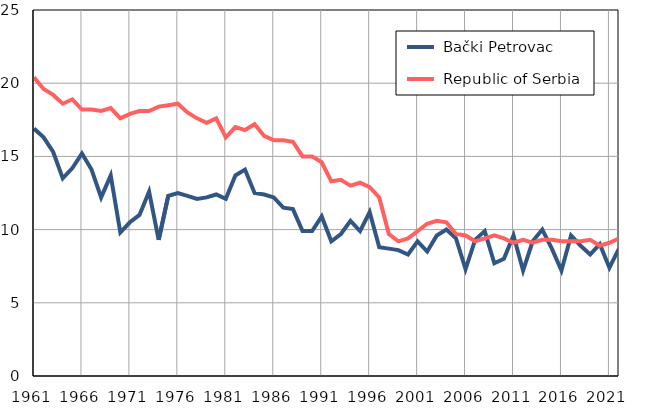
| Category |  Bački Petrovac |  Republic of Serbia |
|---|---|---|
| 1961.0 | 16.9 | 20.4 |
| 1962.0 | 16.3 | 19.6 |
| 1963.0 | 15.3 | 19.2 |
| 1964.0 | 13.5 | 18.6 |
| 1965.0 | 14.2 | 18.9 |
| 1966.0 | 15.2 | 18.2 |
| 1967.0 | 14.1 | 18.2 |
| 1968.0 | 12.2 | 18.1 |
| 1969.0 | 13.7 | 18.3 |
| 1970.0 | 9.8 | 17.6 |
| 1971.0 | 10.5 | 17.9 |
| 1972.0 | 11 | 18.1 |
| 1973.0 | 12.6 | 18.1 |
| 1974.0 | 9.3 | 18.4 |
| 1975.0 | 12.3 | 18.5 |
| 1976.0 | 12.5 | 18.6 |
| 1977.0 | 12.3 | 18 |
| 1978.0 | 12.1 | 17.6 |
| 1979.0 | 12.2 | 17.3 |
| 1980.0 | 12.4 | 17.6 |
| 1981.0 | 12.1 | 16.3 |
| 1982.0 | 13.7 | 17 |
| 1983.0 | 14.1 | 16.8 |
| 1984.0 | 12.5 | 17.2 |
| 1985.0 | 12.4 | 16.4 |
| 1986.0 | 12.2 | 16.1 |
| 1987.0 | 11.5 | 16.1 |
| 1988.0 | 11.4 | 16 |
| 1989.0 | 9.9 | 15 |
| 1990.0 | 9.9 | 15 |
| 1991.0 | 10.9 | 14.6 |
| 1992.0 | 9.2 | 13.3 |
| 1993.0 | 9.7 | 13.4 |
| 1994.0 | 10.6 | 13 |
| 1995.0 | 9.9 | 13.2 |
| 1996.0 | 11.2 | 12.9 |
| 1997.0 | 8.8 | 12.2 |
| 1998.0 | 8.7 | 9.7 |
| 1999.0 | 8.6 | 9.2 |
| 2000.0 | 8.3 | 9.4 |
| 2001.0 | 9.2 | 9.9 |
| 2002.0 | 8.5 | 10.4 |
| 2003.0 | 9.6 | 10.6 |
| 2004.0 | 10 | 10.5 |
| 2005.0 | 9.4 | 9.7 |
| 2006.0 | 7.3 | 9.6 |
| 2007.0 | 9.3 | 9.2 |
| 2008.0 | 9.9 | 9.4 |
| 2009.0 | 7.7 | 9.6 |
| 2010.0 | 8 | 9.4 |
| 2011.0 | 9.6 | 9.1 |
| 2012.0 | 7.2 | 9.3 |
| 2013.0 | 9.2 | 9.1 |
| 2014.0 | 10 | 9.3 |
| 2015.0 | 8.7 | 9.3 |
| 2016.0 | 7.2 | 9.2 |
| 2017.0 | 9.6 | 9.2 |
| 2018.0 | 8.9 | 9.2 |
| 2019.0 | 8.3 | 9.3 |
| 2020.0 | 9 | 8.9 |
| 2021.0 | 7.4 | 9.1 |
| 2022.0 | 8.7 | 9.4 |